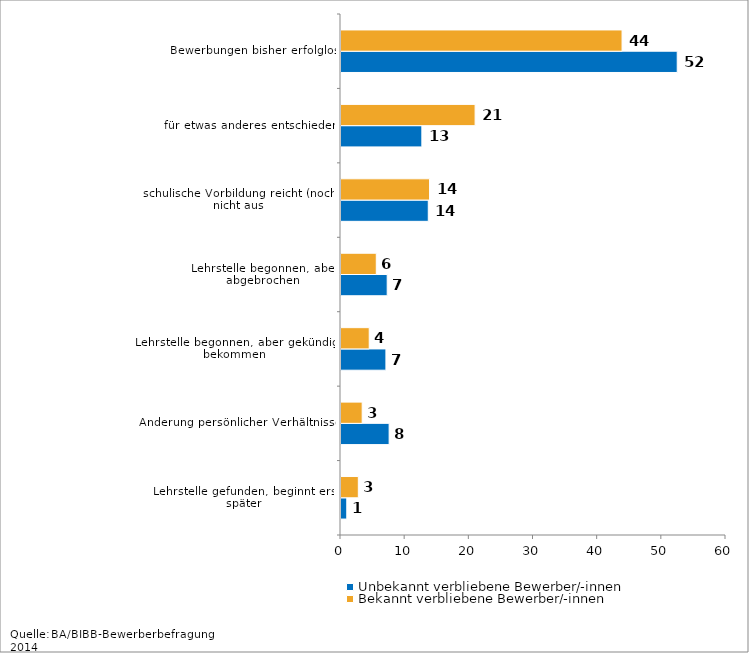
| Category | Unbekannt verbliebene Bewerber/-innen | Bekannt verbliebene Bewerber/-innen |
|---|---|---|
| Lehrstelle gefunden, beginnt erst später | 0.9 | 2.7 |
| Änderung persönlicher Verhältnisse | 7.5 | 3.3 |
| Lehrstelle begonnen, aber gekündigt bekommen | 7 | 4.4 |
| Lehrstelle begonnen, aber abgebrochen | 7.2 | 5.5 |
| schulische Vorbildung reicht (noch) nicht aus | 13.6 | 13.8 |
| für etwas anderes entschieden | 12.6 | 20.9 |
| Bewerbungen bisher erfolglos | 52.4 | 43.8 |